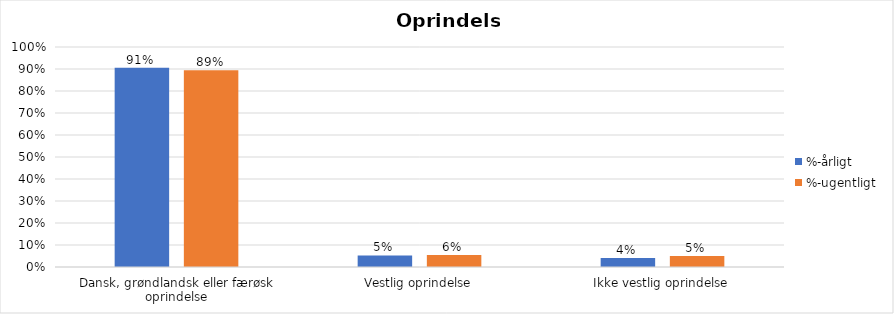
| Category | %-årligt | %-ugentligt |
|---|---|---|
| Dansk, grøndlandsk eller færøsk oprindelse | 0.906 | 0.895 |
| Vestlig oprindelse | 0.053 | 0.055 |
| Ikke vestlig oprindelse | 0.041 | 0.05 |